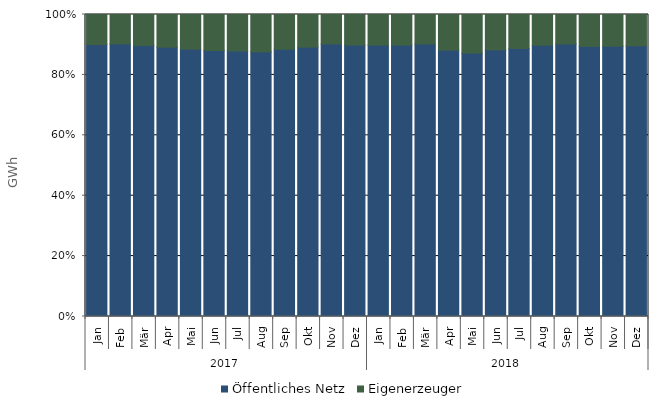
| Category | Öffentliches Netz | Eigenerzeuger |
|---|---|---|
| 0 | 6339966.493 | 700886.17 |
| 1 | 5448240.168 | 586120.472 |
| 2 | 5527775.362 | 630649.688 |
| 3 | 4945230.833 | 600858.698 |
| 4 | 4874553.924 | 632569.638 |
| 5 | 4759659.662 | 644369.89 |
| 6 | 4871149.415 | 669891.225 |
| 7 | 4840038.158 | 683064.412 |
| 8 | 4973167.706 | 647040.901 |
| 9 | 5218232.353 | 631470.62 |
| 10 | 5703052.444 | 615644.306 |
| 11 | 5888572.418 | 661942.106 |
| 12 | 5955846.638 | 669914.699 |
| 13 | 5627670.576 | 635487.148 |
| 14 | 5978885.792 | 646161.9 |
| 15 | 4836318.194 | 648357.645 |
| 16 | 4841684.384 | 708238.601 |
| 17 | 4871617.527 | 645765.735 |
| 18 | 4924930.497 | 623843.245 |
| 19 | 4980749.998 | 564203.309 |
| 20 | 4930297.075 | 532871.232 |
| 21 | 5307842.454 | 625086.377 |
| 22 | 5558995.839 | 651177.962 |
| 23 | 5895096.183 | 680369.806 |